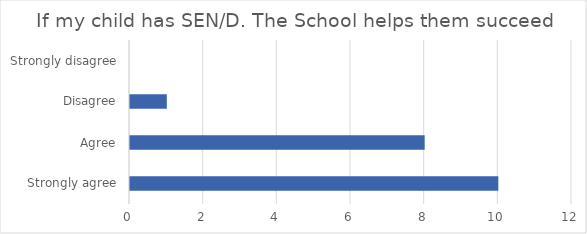
| Category | Series 1 |
|---|---|
| Strongly agree | 10 |
| Agree | 8 |
| Disagree | 1 |
| Strongly disagree | 0 |